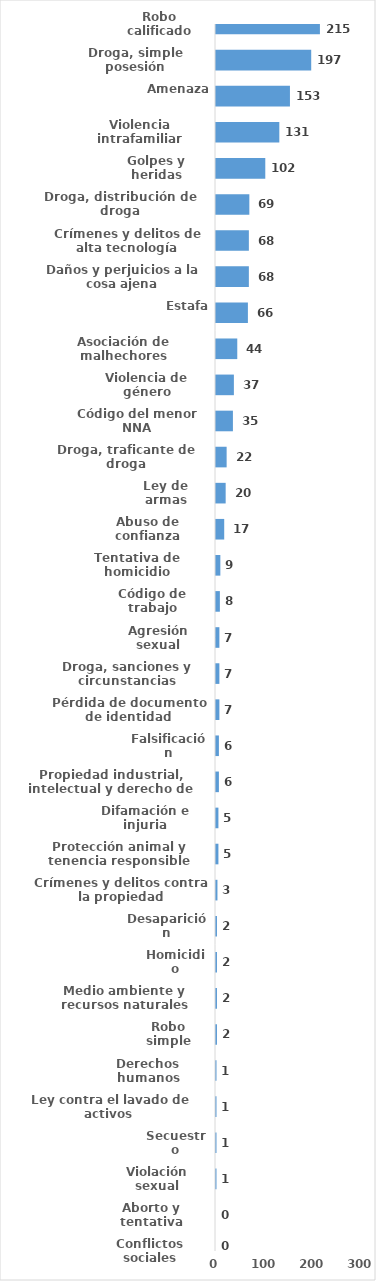
| Category | Series 0 |
|---|---|
| Robo calificado | 215 |
| Droga, simple posesión | 197 |
| Amenaza | 153 |
| Violencia intrafamiliar | 131 |
| Golpes y heridas | 102 |
| Droga, distribución de droga | 69 |
| Crímenes y delitos de alta tecnología | 68 |
| Daños y perjuicios a la cosa ajena | 68 |
| Estafa | 66 |
| Asociación de malhechores | 44 |
| Violencia de género | 37 |
| Código del menor NNA | 35 |
| Droga, traficante de droga | 22 |
| Ley de armas | 20 |
| Abuso de confianza | 17 |
| Tentativa de homicidio | 9 |
| Código de trabajo | 8 |
| Agresión sexual | 7 |
| Droga, sanciones y circunstancias agravantes | 7 |
| Pérdida de documento de identidad | 7 |
| Falsificación | 6 |
| Propiedad industrial, intelectual y derecho de autor | 6 |
| Difamación e injuria | 5 |
| Protección animal y tenencia responsible | 5 |
| Crímenes y delitos contra la propiedad | 3 |
| Desaparición | 2 |
| Homicidio | 2 |
| Medio ambiente y recursos naturales | 2 |
| Robo simple | 2 |
| Derechos humanos | 1 |
| Ley contra el lavado de activos  | 1 |
| Secuestro | 1 |
| Violación sexual | 1 |
| Aborto y tentativa | 0 |
| Conflictos sociales | 0 |